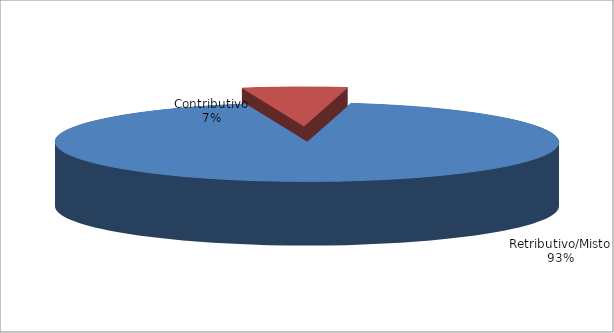
| Category | Series 1 |
|---|---|
| Retributivo/Misto | 235196 |
| Contributivo | 16935 |